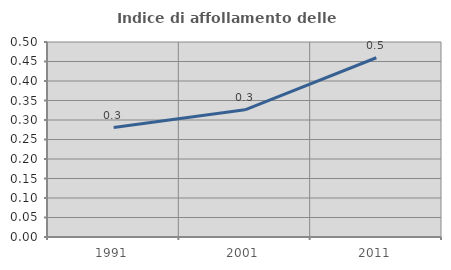
| Category | Indice di affollamento delle abitazioni  |
|---|---|
| 1991.0 | 0.281 |
| 2001.0 | 0.326 |
| 2011.0 | 0.46 |